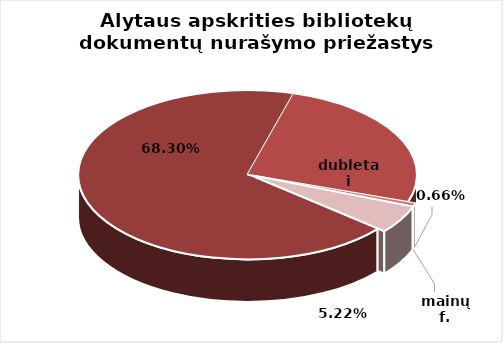
| Category | Series 0 |
|---|---|
| 0 | 39346 |
| 1 | 14873 |
| 2 | 380 |
| 3 | 0 |
| 4 | 3010 |